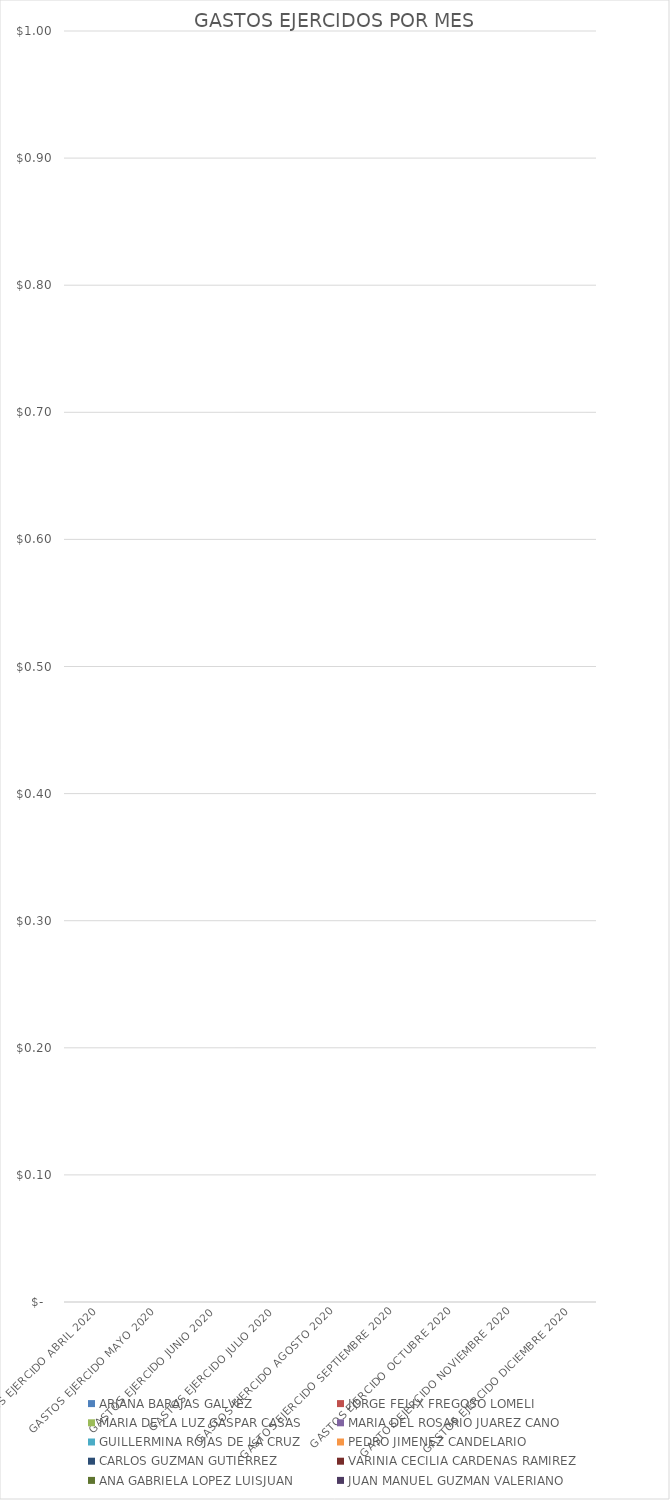
| Category | ARIANA BARAJAS GALVEZ | JORGE FELIX FREGOSO LOMELI | MARIA DE LA LUZ GASPAR CASAS | MARIA DEL ROSARIO JUAREZ CANO | GUILLERMINA ROJAS DE LA CRUZ | PEDRO JIMENEZ CANDELARIO | CARLOS GUZMAN GUTIERREZ | VARINIA CECILIA CARDENAS RAMIREZ | ANA GABRIELA LOPEZ LUISJUAN | JUAN MANUEL GUZMAN VALERIANO |
|---|---|---|---|---|---|---|---|---|---|---|
| GASTOS EJERCIDO ABRIL 2020 | 0 | 0 | 0 | 0 | 0 | 0 | 0 | 0 | 0 | 0 |
| GASTOS EJERCIDO MAYO 2020 | 0 | 0 | 0 | 0 | 0 | 0 | 0 | 0 | 0 | 0 |
| GASTOS EJERCIDO JUNIO 2020 | 0 | 0 | 0 | 0 | 0 | 0 | 0 | 0 | 0 | 0 |
| GASTOS EJERCIDO JULIO 2020 | 0 | 0 | 0 | 0 | 0 | 0 | 0 | 0 | 0 | 0 |
| GASTOS EJERCIDO AGOSTO 2020 | 0 | 0 | 0 | 0 | 0 | 0 | 0 | 0 | 0 | 0 |
| GASTOS EJERCIDO SEPTIEMBRE 2020 | 0 | 0 | 0 | 0 | 0 | 0 | 0 | 0 | 0 | 0 |
| GASTOS EJERCIDO OCTUBRE 2020 | 0 | 0 | 0 | 0 | 0 | 0 | 0 | 0 | 0 | 0 |
| GASTOS EJERCIDO NOVIEMBRE 2020 | 0 | 0 | 0 | 0 | 0 | 0 | 0 | 0 | 0 | 0 |
| GASTOS EJERCIDO DICIEMBRE 2020 | 0 | 0 | 0 | 0 | 0 | 0 | 0 | 0 | 0 | 0 |